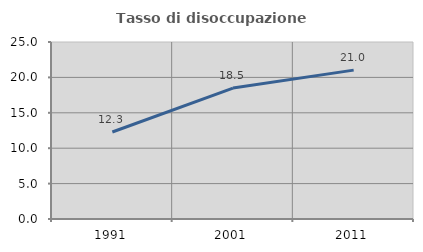
| Category | Tasso di disoccupazione giovanile  |
|---|---|
| 1991.0 | 12.288 |
| 2001.0 | 18.493 |
| 2011.0 | 21.028 |